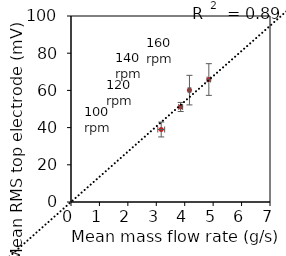
| Category | Series 0 |
|---|---|
| 3.1734999999999993 | 38.974 |
| 3.8581333333333334 | 51.095 |
| 4.166566666666667 | 60.149 |
| 4.848733333333334 | 65.855 |